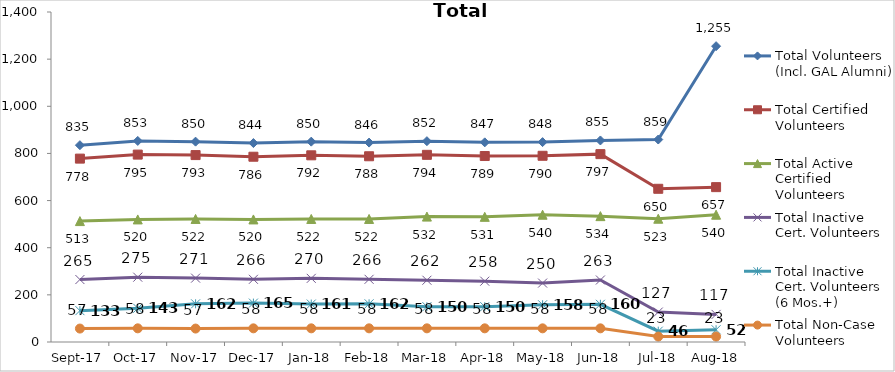
| Category | Total Volunteers (Incl. GAL Alumni) | Total Certified Volunteers | Total Active Certified Volunteers | Total Inactive Cert. Volunteers | Total Inactive Cert. Volunteers (6 Mos.+) | Total Non-Case Volunteers |
|---|---|---|---|---|---|---|
| 2017-09-01 | 835 | 778 | 513 | 265 | 133 | 57 |
| 2017-10-01 | 853 | 795 | 520 | 275 | 143 | 58 |
| 2017-11-01 | 850 | 793 | 522 | 271 | 162 | 57 |
| 2017-12-01 | 844 | 786 | 520 | 266 | 165 | 58 |
| 2018-01-01 | 850 | 792 | 522 | 270 | 161 | 58 |
| 2018-02-01 | 846 | 788 | 522 | 266 | 162 | 58 |
| 2018-03-01 | 852 | 794 | 532 | 262 | 150 | 58 |
| 2018-04-01 | 847 | 789 | 531 | 258 | 150 | 58 |
| 2018-05-01 | 848 | 790 | 540 | 250 | 158 | 58 |
| 2018-06-01 | 855 | 797 | 534 | 263 | 160 | 58 |
| 2018-07-01 | 859 | 650 | 523 | 127 | 46 | 23 |
| 2018-08-01 | 1255 | 657 | 540 | 117 | 52 | 23 |